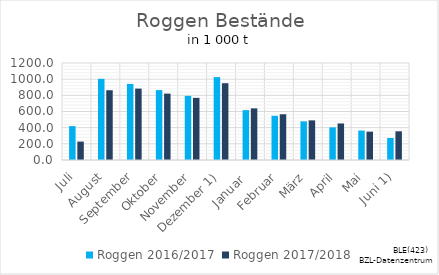
| Category | Roggen |
|---|---|
| Juli | 227.568 |
| August | 863.053 |
| September | 883.408 |
| Oktober | 821.297 |
| November | 769.015 |
| Dezember 1) | 949.863 |
| Januar  | 638.413 |
| Februar | 565.807 |
| März | 490.206 |
| April | 452.243 |
| Mai | 350.658 |
| Juni 1) | 354.912 |